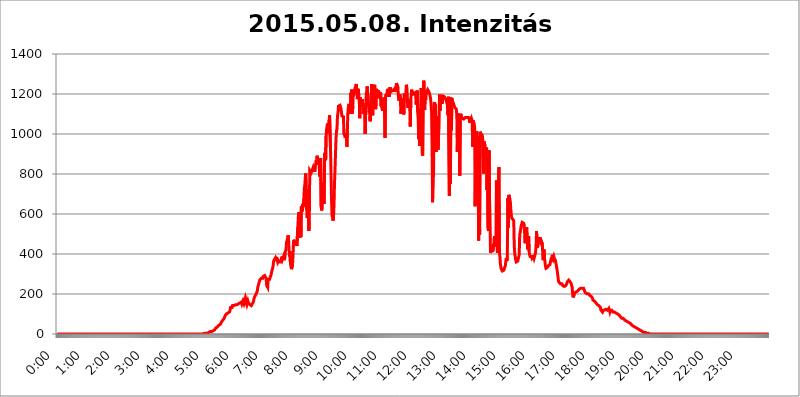
| Category | 2015.05.08. Intenzitás [W/m^2] |
|---|---|
| 0.0 | 0 |
| 0.0006944444444444445 | 0 |
| 0.001388888888888889 | 0 |
| 0.0020833333333333333 | 0 |
| 0.002777777777777778 | 0 |
| 0.003472222222222222 | 0 |
| 0.004166666666666667 | 0 |
| 0.004861111111111111 | 0 |
| 0.005555555555555556 | 0 |
| 0.0062499999999999995 | 0 |
| 0.006944444444444444 | 0 |
| 0.007638888888888889 | 0 |
| 0.008333333333333333 | 0 |
| 0.009027777777777779 | 0 |
| 0.009722222222222222 | 0 |
| 0.010416666666666666 | 0 |
| 0.011111111111111112 | 0 |
| 0.011805555555555555 | 0 |
| 0.012499999999999999 | 0 |
| 0.013194444444444444 | 0 |
| 0.013888888888888888 | 0 |
| 0.014583333333333332 | 0 |
| 0.015277777777777777 | 0 |
| 0.015972222222222224 | 0 |
| 0.016666666666666666 | 0 |
| 0.017361111111111112 | 0 |
| 0.018055555555555557 | 0 |
| 0.01875 | 0 |
| 0.019444444444444445 | 0 |
| 0.02013888888888889 | 0 |
| 0.020833333333333332 | 0 |
| 0.02152777777777778 | 0 |
| 0.022222222222222223 | 0 |
| 0.02291666666666667 | 0 |
| 0.02361111111111111 | 0 |
| 0.024305555555555556 | 0 |
| 0.024999999999999998 | 0 |
| 0.025694444444444447 | 0 |
| 0.02638888888888889 | 0 |
| 0.027083333333333334 | 0 |
| 0.027777777777777776 | 0 |
| 0.02847222222222222 | 0 |
| 0.029166666666666664 | 0 |
| 0.029861111111111113 | 0 |
| 0.030555555555555555 | 0 |
| 0.03125 | 0 |
| 0.03194444444444445 | 0 |
| 0.03263888888888889 | 0 |
| 0.03333333333333333 | 0 |
| 0.034027777777777775 | 0 |
| 0.034722222222222224 | 0 |
| 0.035416666666666666 | 0 |
| 0.036111111111111115 | 0 |
| 0.03680555555555556 | 0 |
| 0.0375 | 0 |
| 0.03819444444444444 | 0 |
| 0.03888888888888889 | 0 |
| 0.03958333333333333 | 0 |
| 0.04027777777777778 | 0 |
| 0.04097222222222222 | 0 |
| 0.041666666666666664 | 0 |
| 0.042361111111111106 | 0 |
| 0.04305555555555556 | 0 |
| 0.043750000000000004 | 0 |
| 0.044444444444444446 | 0 |
| 0.04513888888888889 | 0 |
| 0.04583333333333334 | 0 |
| 0.04652777777777778 | 0 |
| 0.04722222222222222 | 0 |
| 0.04791666666666666 | 0 |
| 0.04861111111111111 | 0 |
| 0.049305555555555554 | 0 |
| 0.049999999999999996 | 0 |
| 0.05069444444444445 | 0 |
| 0.051388888888888894 | 0 |
| 0.052083333333333336 | 0 |
| 0.05277777777777778 | 0 |
| 0.05347222222222222 | 0 |
| 0.05416666666666667 | 0 |
| 0.05486111111111111 | 0 |
| 0.05555555555555555 | 0 |
| 0.05625 | 0 |
| 0.05694444444444444 | 0 |
| 0.057638888888888885 | 0 |
| 0.05833333333333333 | 0 |
| 0.05902777777777778 | 0 |
| 0.059722222222222225 | 0 |
| 0.06041666666666667 | 0 |
| 0.061111111111111116 | 0 |
| 0.06180555555555556 | 0 |
| 0.0625 | 0 |
| 0.06319444444444444 | 0 |
| 0.06388888888888888 | 0 |
| 0.06458333333333334 | 0 |
| 0.06527777777777778 | 0 |
| 0.06597222222222222 | 0 |
| 0.06666666666666667 | 0 |
| 0.06736111111111111 | 0 |
| 0.06805555555555555 | 0 |
| 0.06874999999999999 | 0 |
| 0.06944444444444443 | 0 |
| 0.07013888888888889 | 0 |
| 0.07083333333333333 | 0 |
| 0.07152777777777779 | 0 |
| 0.07222222222222223 | 0 |
| 0.07291666666666667 | 0 |
| 0.07361111111111111 | 0 |
| 0.07430555555555556 | 0 |
| 0.075 | 0 |
| 0.07569444444444444 | 0 |
| 0.0763888888888889 | 0 |
| 0.07708333333333334 | 0 |
| 0.07777777777777778 | 0 |
| 0.07847222222222222 | 0 |
| 0.07916666666666666 | 0 |
| 0.0798611111111111 | 0 |
| 0.08055555555555556 | 0 |
| 0.08125 | 0 |
| 0.08194444444444444 | 0 |
| 0.08263888888888889 | 0 |
| 0.08333333333333333 | 0 |
| 0.08402777777777777 | 0 |
| 0.08472222222222221 | 0 |
| 0.08541666666666665 | 0 |
| 0.08611111111111112 | 0 |
| 0.08680555555555557 | 0 |
| 0.08750000000000001 | 0 |
| 0.08819444444444445 | 0 |
| 0.08888888888888889 | 0 |
| 0.08958333333333333 | 0 |
| 0.09027777777777778 | 0 |
| 0.09097222222222222 | 0 |
| 0.09166666666666667 | 0 |
| 0.09236111111111112 | 0 |
| 0.09305555555555556 | 0 |
| 0.09375 | 0 |
| 0.09444444444444444 | 0 |
| 0.09513888888888888 | 0 |
| 0.09583333333333333 | 0 |
| 0.09652777777777777 | 0 |
| 0.09722222222222222 | 0 |
| 0.09791666666666667 | 0 |
| 0.09861111111111111 | 0 |
| 0.09930555555555555 | 0 |
| 0.09999999999999999 | 0 |
| 0.10069444444444443 | 0 |
| 0.1013888888888889 | 0 |
| 0.10208333333333335 | 0 |
| 0.10277777777777779 | 0 |
| 0.10347222222222223 | 0 |
| 0.10416666666666667 | 0 |
| 0.10486111111111111 | 0 |
| 0.10555555555555556 | 0 |
| 0.10625 | 0 |
| 0.10694444444444444 | 0 |
| 0.1076388888888889 | 0 |
| 0.10833333333333334 | 0 |
| 0.10902777777777778 | 0 |
| 0.10972222222222222 | 0 |
| 0.1111111111111111 | 0 |
| 0.11180555555555556 | 0 |
| 0.11180555555555556 | 0 |
| 0.1125 | 0 |
| 0.11319444444444444 | 0 |
| 0.11388888888888889 | 0 |
| 0.11458333333333333 | 0 |
| 0.11527777777777777 | 0 |
| 0.11597222222222221 | 0 |
| 0.11666666666666665 | 0 |
| 0.1173611111111111 | 0 |
| 0.11805555555555557 | 0 |
| 0.11944444444444445 | 0 |
| 0.12013888888888889 | 0 |
| 0.12083333333333333 | 0 |
| 0.12152777777777778 | 0 |
| 0.12222222222222223 | 0 |
| 0.12291666666666667 | 0 |
| 0.12291666666666667 | 0 |
| 0.12361111111111112 | 0 |
| 0.12430555555555556 | 0 |
| 0.125 | 0 |
| 0.12569444444444444 | 0 |
| 0.12638888888888888 | 0 |
| 0.12708333333333333 | 0 |
| 0.16875 | 0 |
| 0.12847222222222224 | 0 |
| 0.12916666666666668 | 0 |
| 0.12986111111111112 | 0 |
| 0.13055555555555556 | 0 |
| 0.13125 | 0 |
| 0.13194444444444445 | 0 |
| 0.1326388888888889 | 0 |
| 0.13333333333333333 | 0 |
| 0.13402777777777777 | 0 |
| 0.13402777777777777 | 0 |
| 0.13472222222222222 | 0 |
| 0.13541666666666666 | 0 |
| 0.1361111111111111 | 0 |
| 0.13749999999999998 | 0 |
| 0.13819444444444443 | 0 |
| 0.1388888888888889 | 0 |
| 0.13958333333333334 | 0 |
| 0.14027777777777778 | 0 |
| 0.14097222222222222 | 0 |
| 0.14166666666666666 | 0 |
| 0.1423611111111111 | 0 |
| 0.14305555555555557 | 0 |
| 0.14375000000000002 | 0 |
| 0.14444444444444446 | 0 |
| 0.1451388888888889 | 0 |
| 0.1451388888888889 | 0 |
| 0.14652777777777778 | 0 |
| 0.14722222222222223 | 0 |
| 0.14791666666666667 | 0 |
| 0.1486111111111111 | 0 |
| 0.14930555555555555 | 0 |
| 0.15 | 0 |
| 0.15069444444444444 | 0 |
| 0.15138888888888888 | 0 |
| 0.15208333333333332 | 0 |
| 0.15277777777777776 | 0 |
| 0.15347222222222223 | 0 |
| 0.15416666666666667 | 0 |
| 0.15486111111111112 | 0 |
| 0.15555555555555556 | 0 |
| 0.15625 | 0 |
| 0.15694444444444444 | 0 |
| 0.15763888888888888 | 0 |
| 0.15833333333333333 | 0 |
| 0.15902777777777777 | 0 |
| 0.15972222222222224 | 0 |
| 0.16041666666666668 | 0 |
| 0.16111111111111112 | 0 |
| 0.16180555555555556 | 0 |
| 0.1625 | 0 |
| 0.16319444444444445 | 0 |
| 0.1638888888888889 | 0 |
| 0.16458333333333333 | 0 |
| 0.16527777777777777 | 0 |
| 0.16597222222222222 | 0 |
| 0.16666666666666666 | 0 |
| 0.1673611111111111 | 0 |
| 0.16805555555555554 | 0 |
| 0.16874999999999998 | 0 |
| 0.16944444444444443 | 0 |
| 0.17013888888888887 | 0 |
| 0.1708333333333333 | 0 |
| 0.17152777777777775 | 0 |
| 0.17222222222222225 | 0 |
| 0.1729166666666667 | 0 |
| 0.17361111111111113 | 0 |
| 0.17430555555555557 | 0 |
| 0.17500000000000002 | 0 |
| 0.17569444444444446 | 0 |
| 0.1763888888888889 | 0 |
| 0.17708333333333334 | 0 |
| 0.17777777777777778 | 0 |
| 0.17847222222222223 | 0 |
| 0.17916666666666667 | 0 |
| 0.1798611111111111 | 0 |
| 0.18055555555555555 | 0 |
| 0.18125 | 0 |
| 0.18194444444444444 | 0 |
| 0.1826388888888889 | 0 |
| 0.18333333333333335 | 0 |
| 0.1840277777777778 | 0 |
| 0.18472222222222223 | 0 |
| 0.18541666666666667 | 0 |
| 0.18611111111111112 | 0 |
| 0.18680555555555556 | 0 |
| 0.1875 | 0 |
| 0.18819444444444444 | 0 |
| 0.18888888888888888 | 0 |
| 0.18958333333333333 | 0 |
| 0.19027777777777777 | 0 |
| 0.1909722222222222 | 0 |
| 0.19166666666666665 | 0 |
| 0.19236111111111112 | 0 |
| 0.19305555555555554 | 0 |
| 0.19375 | 0 |
| 0.19444444444444445 | 0 |
| 0.1951388888888889 | 0 |
| 0.19583333333333333 | 0 |
| 0.19652777777777777 | 0 |
| 0.19722222222222222 | 0 |
| 0.19791666666666666 | 0 |
| 0.1986111111111111 | 0 |
| 0.19930555555555554 | 0 |
| 0.19999999999999998 | 0 |
| 0.20069444444444443 | 0 |
| 0.20138888888888887 | 0 |
| 0.2020833333333333 | 0 |
| 0.2027777777777778 | 0 |
| 0.2034722222222222 | 0 |
| 0.2041666666666667 | 0 |
| 0.20486111111111113 | 0 |
| 0.20555555555555557 | 0 |
| 0.20625000000000002 | 3.525 |
| 0.20694444444444446 | 3.525 |
| 0.2076388888888889 | 3.525 |
| 0.20833333333333334 | 3.525 |
| 0.20902777777777778 | 3.525 |
| 0.20972222222222223 | 3.525 |
| 0.21041666666666667 | 3.525 |
| 0.2111111111111111 | 7.887 |
| 0.21180555555555555 | 7.887 |
| 0.2125 | 7.887 |
| 0.21319444444444444 | 7.887 |
| 0.2138888888888889 | 12.257 |
| 0.21458333333333335 | 12.257 |
| 0.2152777777777778 | 12.257 |
| 0.21597222222222223 | 12.257 |
| 0.21666666666666667 | 12.257 |
| 0.21736111111111112 | 12.257 |
| 0.21805555555555556 | 16.636 |
| 0.21875 | 16.636 |
| 0.21944444444444444 | 21.024 |
| 0.22013888888888888 | 21.024 |
| 0.22083333333333333 | 21.024 |
| 0.22152777777777777 | 25.419 |
| 0.2222222222222222 | 29.823 |
| 0.22291666666666665 | 29.823 |
| 0.2236111111111111 | 29.823 |
| 0.22430555555555556 | 34.234 |
| 0.225 | 38.653 |
| 0.22569444444444445 | 38.653 |
| 0.2263888888888889 | 43.079 |
| 0.22708333333333333 | 43.079 |
| 0.22777777777777777 | 47.511 |
| 0.22847222222222222 | 47.511 |
| 0.22916666666666666 | 51.951 |
| 0.2298611111111111 | 56.398 |
| 0.23055555555555554 | 60.85 |
| 0.23124999999999998 | 65.31 |
| 0.23194444444444443 | 65.31 |
| 0.23263888888888887 | 69.775 |
| 0.2333333333333333 | 74.246 |
| 0.2340277777777778 | 74.246 |
| 0.2347222222222222 | 83.205 |
| 0.2354166666666667 | 92.184 |
| 0.23611111111111113 | 92.184 |
| 0.23680555555555557 | 96.682 |
| 0.23750000000000002 | 101.184 |
| 0.23819444444444446 | 105.69 |
| 0.2388888888888889 | 105.69 |
| 0.23958333333333334 | 105.69 |
| 0.24027777777777778 | 110.201 |
| 0.24097222222222223 | 110.201 |
| 0.24166666666666667 | 110.201 |
| 0.2423611111111111 | 119.235 |
| 0.24305555555555555 | 132.814 |
| 0.24375 | 137.347 |
| 0.24444444444444446 | 128.284 |
| 0.24513888888888888 | 132.814 |
| 0.24583333333333335 | 141.884 |
| 0.2465277777777778 | 137.347 |
| 0.24722222222222223 | 141.884 |
| 0.24791666666666667 | 141.884 |
| 0.24861111111111112 | 141.884 |
| 0.24930555555555556 | 146.423 |
| 0.25 | 146.423 |
| 0.25069444444444444 | 146.423 |
| 0.2513888888888889 | 146.423 |
| 0.2520833333333333 | 146.423 |
| 0.25277777777777777 | 146.423 |
| 0.2534722222222222 | 146.423 |
| 0.25416666666666665 | 150.964 |
| 0.2548611111111111 | 150.964 |
| 0.2555555555555556 | 155.509 |
| 0.25625000000000003 | 155.509 |
| 0.2569444444444445 | 155.509 |
| 0.2576388888888889 | 160.056 |
| 0.25833333333333336 | 160.056 |
| 0.2590277777777778 | 150.964 |
| 0.25972222222222224 | 155.509 |
| 0.2604166666666667 | 164.605 |
| 0.2611111111111111 | 164.605 |
| 0.26180555555555557 | 150.964 |
| 0.2625 | 160.056 |
| 0.26319444444444445 | 173.709 |
| 0.2638888888888889 | 182.82 |
| 0.26458333333333334 | 173.709 |
| 0.2652777777777778 | 155.509 |
| 0.2659722222222222 | 146.423 |
| 0.26666666666666666 | 150.964 |
| 0.2673611111111111 | 164.605 |
| 0.26805555555555555 | 155.509 |
| 0.26875 | 155.509 |
| 0.26944444444444443 | 150.964 |
| 0.2701388888888889 | 146.423 |
| 0.2708333333333333 | 141.884 |
| 0.27152777777777776 | 141.884 |
| 0.2722222222222222 | 141.884 |
| 0.27291666666666664 | 146.423 |
| 0.2736111111111111 | 150.964 |
| 0.2743055555555555 | 155.509 |
| 0.27499999999999997 | 160.056 |
| 0.27569444444444446 | 164.605 |
| 0.27638888888888885 | 182.82 |
| 0.27708333333333335 | 182.82 |
| 0.2777777777777778 | 187.378 |
| 0.27847222222222223 | 196.497 |
| 0.2791666666666667 | 196.497 |
| 0.2798611111111111 | 201.058 |
| 0.28055555555555556 | 214.746 |
| 0.28125 | 233 |
| 0.28194444444444444 | 242.127 |
| 0.2826388888888889 | 251.251 |
| 0.2833333333333333 | 260.373 |
| 0.28402777777777777 | 269.49 |
| 0.2847222222222222 | 274.047 |
| 0.28541666666666665 | 269.49 |
| 0.28611111111111115 | 278.603 |
| 0.28680555555555554 | 278.603 |
| 0.28750000000000003 | 274.047 |
| 0.2881944444444445 | 278.603 |
| 0.2888888888888889 | 287.709 |
| 0.28958333333333336 | 287.709 |
| 0.2902777777777778 | 287.709 |
| 0.29097222222222224 | 292.259 |
| 0.2916666666666667 | 292.259 |
| 0.2923611111111111 | 283.156 |
| 0.29305555555555557 | 274.047 |
| 0.29375 | 242.127 |
| 0.29444444444444445 | 237.564 |
| 0.2951388888888889 | 233 |
| 0.29583333333333334 | 274.047 |
| 0.2965277777777778 | 269.49 |
| 0.2972222222222222 | 269.49 |
| 0.29791666666666666 | 274.047 |
| 0.2986111111111111 | 283.156 |
| 0.29930555555555555 | 283.156 |
| 0.3 | 296.808 |
| 0.30069444444444443 | 310.44 |
| 0.3013888888888889 | 319.517 |
| 0.3020833333333333 | 328.584 |
| 0.30277777777777776 | 342.162 |
| 0.3034722222222222 | 364.728 |
| 0.30416666666666664 | 369.23 |
| 0.3048611111111111 | 373.729 |
| 0.3055555555555555 | 378.224 |
| 0.30624999999999997 | 382.715 |
| 0.3069444444444444 | 382.715 |
| 0.3076388888888889 | 373.729 |
| 0.30833333333333335 | 369.23 |
| 0.3090277777777778 | 360.221 |
| 0.30972222222222223 | 369.23 |
| 0.3104166666666667 | 373.729 |
| 0.3111111111111111 | 360.221 |
| 0.31180555555555556 | 364.728 |
| 0.3125 | 360.221 |
| 0.31319444444444444 | 360.221 |
| 0.3138888888888889 | 369.23 |
| 0.3145833333333333 | 378.224 |
| 0.31527777777777777 | 387.202 |
| 0.3159722222222222 | 373.729 |
| 0.31666666666666665 | 369.23 |
| 0.31736111111111115 | 387.202 |
| 0.31805555555555554 | 378.224 |
| 0.31875000000000003 | 369.23 |
| 0.3194444444444445 | 405.108 |
| 0.3201388888888889 | 409.574 |
| 0.32083333333333336 | 422.943 |
| 0.3215277777777778 | 458.38 |
| 0.32222222222222224 | 467.187 |
| 0.3229166666666667 | 475.972 |
| 0.3236111111111111 | 493.475 |
| 0.32430555555555557 | 484.735 |
| 0.325 | 427.39 |
| 0.32569444444444445 | 387.202 |
| 0.3263888888888889 | 414.035 |
| 0.32708333333333334 | 351.198 |
| 0.3277777777777778 | 355.712 |
| 0.3284722222222222 | 324.052 |
| 0.32916666666666666 | 319.517 |
| 0.3298611111111111 | 342.162 |
| 0.33055555555555555 | 382.715 |
| 0.33125 | 453.968 |
| 0.33194444444444443 | 471.582 |
| 0.3326388888888889 | 458.38 |
| 0.3333333333333333 | 449.551 |
| 0.3340277777777778 | 445.129 |
| 0.3347222222222222 | 449.551 |
| 0.3354166666666667 | 458.38 |
| 0.3361111111111111 | 440.702 |
| 0.3368055555555556 | 440.702 |
| 0.33749999999999997 | 536.82 |
| 0.33819444444444446 | 588.009 |
| 0.33888888888888885 | 609.062 |
| 0.33958333333333335 | 613.252 |
| 0.34027777777777773 | 480.356 |
| 0.34097222222222223 | 609.062 |
| 0.3416666666666666 | 484.735 |
| 0.3423611111111111 | 638.256 |
| 0.3430555555555555 | 634.105 |
| 0.34375 | 613.252 |
| 0.3444444444444445 | 650.667 |
| 0.3451388888888889 | 638.256 |
| 0.3458333333333334 | 675.311 |
| 0.34652777777777777 | 727.896 |
| 0.34722222222222227 | 743.859 |
| 0.34791666666666665 | 783.342 |
| 0.34861111111111115 | 802.868 |
| 0.34930555555555554 | 629.948 |
| 0.35000000000000003 | 617.436 |
| 0.3506944444444444 | 579.542 |
| 0.3513888888888889 | 679.395 |
| 0.3520833333333333 | 723.889 |
| 0.3527777777777778 | 515.223 |
| 0.3534722222222222 | 558.261 |
| 0.3541666666666667 | 818.392 |
| 0.3548611111111111 | 822.26 |
| 0.35555555555555557 | 818.392 |
| 0.35625 | 806.757 |
| 0.35694444444444445 | 806.757 |
| 0.3576388888888889 | 806.757 |
| 0.35833333333333334 | 826.123 |
| 0.3590277777777778 | 833.834 |
| 0.3597222222222222 | 829.981 |
| 0.36041666666666666 | 833.834 |
| 0.3611111111111111 | 810.641 |
| 0.36180555555555555 | 837.682 |
| 0.3625 | 849.199 |
| 0.36319444444444443 | 868.305 |
| 0.3638888888888889 | 853.029 |
| 0.3645833333333333 | 891.099 |
| 0.3652777777777778 | 860.676 |
| 0.3659722222222222 | 845.365 |
| 0.3666666666666667 | 872.114 |
| 0.3673611111111111 | 845.365 |
| 0.3680555555555556 | 787.258 |
| 0.36874999999999997 | 860.676 |
| 0.36944444444444446 | 879.719 |
| 0.37013888888888885 | 638.256 |
| 0.37083333333333335 | 617.436 |
| 0.37152777777777773 | 634.105 |
| 0.37222222222222223 | 759.723 |
| 0.3729166666666666 | 735.89 |
| 0.3736111111111111 | 667.123 |
| 0.3743055555555555 | 650.667 |
| 0.375 | 906.223 |
| 0.3756944444444445 | 894.885 |
| 0.3763888888888889 | 868.305 |
| 0.3770833333333334 | 988.714 |
| 0.37777777777777777 | 1022.323 |
| 0.37847222222222227 | 1041.019 |
| 0.37916666666666665 | 1052.255 |
| 0.37986111111111115 | 1011.118 |
| 0.38055555555555554 | 1003.65 |
| 0.38125000000000003 | 1067.267 |
| 0.3819444444444444 | 1093.653 |
| 0.3826388888888889 | 1089.873 |
| 0.3833333333333333 | 913.766 |
| 0.3840277777777778 | 913.766 |
| 0.3847222222222222 | 667.123 |
| 0.3854166666666667 | 592.233 |
| 0.3861111111111111 | 583.779 |
| 0.38680555555555557 | 566.793 |
| 0.3875 | 583.779 |
| 0.38819444444444445 | 650.667 |
| 0.3888888888888889 | 755.766 |
| 0.38958333333333334 | 822.26 |
| 0.3902777777777778 | 902.447 |
| 0.3909722222222222 | 977.508 |
| 0.39166666666666666 | 1014.852 |
| 0.3923611111111111 | 1026.06 |
| 0.39305555555555555 | 1089.873 |
| 0.39375 | 1105.019 |
| 0.39444444444444443 | 1139.384 |
| 0.3951388888888889 | 1135.543 |
| 0.3958333333333333 | 1139.384 |
| 0.3965277777777778 | 1143.232 |
| 0.3972222222222222 | 1147.086 |
| 0.3979166666666667 | 1127.879 |
| 0.3986111111111111 | 1124.056 |
| 0.3993055555555556 | 1089.873 |
| 0.39999999999999997 | 1086.097 |
| 0.40069444444444446 | 1093.653 |
| 0.40138888888888885 | 1086.097 |
| 0.40208333333333335 | 996.182 |
| 0.40277777777777773 | 1003.65 |
| 0.40347222222222223 | 988.714 |
| 0.4041666666666666 | 992.448 |
| 0.4048611111111111 | 984.98 |
| 0.4055555555555555 | 992.448 |
| 0.40625 | 936.33 |
| 0.4069444444444445 | 1029.798 |
| 0.4076388888888889 | 1108.816 |
| 0.4083333333333334 | 1135.543 |
| 0.40902777777777777 | 1150.946 |
| 0.40972222222222227 | 1143.232 |
| 0.41041666666666665 | 1124.056 |
| 0.41111111111111115 | 1101.226 |
| 0.41180555555555554 | 1205.82 |
| 0.41250000000000003 | 1182.099 |
| 0.4131944444444444 | 1221.83 |
| 0.4138888888888889 | 1101.226 |
| 0.4145833333333333 | 1143.232 |
| 0.4152777777777778 | 1209.807 |
| 0.4159722222222222 | 1193.918 |
| 0.4166666666666667 | 1213.804 |
| 0.4173611111111111 | 1225.859 |
| 0.41805555555555557 | 1233.951 |
| 0.41875 | 1242.089 |
| 0.41944444444444445 | 1250.275 |
| 0.4201388888888889 | 1217.812 |
| 0.42083333333333334 | 1174.263 |
| 0.4215277777777778 | 1201.843 |
| 0.4222222222222222 | 1225.859 |
| 0.42291666666666666 | 1189.969 |
| 0.4236111111111111 | 1166.46 |
| 0.42430555555555555 | 1078.555 |
| 0.425 | 1182.099 |
| 0.42569444444444443 | 1135.543 |
| 0.4263888888888889 | 1147.086 |
| 0.4270833333333333 | 1139.384 |
| 0.4277777777777778 | 1174.263 |
| 0.4284722222222222 | 1147.086 |
| 0.4291666666666667 | 1108.816 |
| 0.4298611111111111 | 1101.226 |
| 0.4305555555555556 | 1120.238 |
| 0.43124999999999997 | 1154.814 |
| 0.43194444444444446 | 999.916 |
| 0.43263888888888885 | 1116.426 |
| 0.43333333333333335 | 1197.876 |
| 0.43402777777777773 | 1213.804 |
| 0.43472222222222223 | 1238.014 |
| 0.4354166666666666 | 1233.951 |
| 0.4361111111111111 | 1162.571 |
| 0.4368055555555555 | 1162.571 |
| 0.4375 | 1108.816 |
| 0.4381944444444445 | 1124.056 |
| 0.4388888888888889 | 1063.51 |
| 0.4395833333333334 | 1120.238 |
| 0.44027777777777777 | 1158.689 |
| 0.44097222222222227 | 1250.275 |
| 0.44166666666666665 | 1246.176 |
| 0.44236111111111115 | 1093.653 |
| 0.44305555555555554 | 1186.03 |
| 0.44375000000000003 | 1135.543 |
| 0.4444444444444444 | 1233.951 |
| 0.4451388888888889 | 1246.176 |
| 0.4458333333333333 | 1174.263 |
| 0.4465277777777778 | 1124.056 |
| 0.4472222222222222 | 1154.814 |
| 0.4479166666666667 | 1225.859 |
| 0.4486111111111111 | 1178.177 |
| 0.44930555555555557 | 1209.807 |
| 0.45 | 1197.876 |
| 0.45069444444444445 | 1217.812 |
| 0.4513888888888889 | 1182.099 |
| 0.45208333333333334 | 1178.177 |
| 0.4527777777777778 | 1186.03 |
| 0.4534722222222222 | 1209.807 |
| 0.45416666666666666 | 1139.384 |
| 0.4548611111111111 | 1147.086 |
| 0.45555555555555555 | 1143.232 |
| 0.45625 | 1116.426 |
| 0.45694444444444443 | 1154.814 |
| 0.4576388888888889 | 1174.263 |
| 0.4583333333333333 | 1182.099 |
| 0.4590277777777778 | 1097.437 |
| 0.4597222222222222 | 981.244 |
| 0.4604166666666667 | 1186.03 |
| 0.4611111111111111 | 1197.876 |
| 0.4618055555555556 | 1186.03 |
| 0.46249999999999997 | 1201.843 |
| 0.46319444444444446 | 1225.859 |
| 0.46388888888888885 | 1197.876 |
| 0.46458333333333335 | 1189.969 |
| 0.46527777777777773 | 1205.82 |
| 0.46597222222222223 | 1186.03 |
| 0.4666666666666666 | 1233.951 |
| 0.4673611111111111 | 1221.83 |
| 0.4680555555555555 | 1225.859 |
| 0.46875 | 1213.804 |
| 0.4694444444444445 | 1217.812 |
| 0.4701388888888889 | 1217.812 |
| 0.4708333333333334 | 1217.812 |
| 0.47152777777777777 | 1221.83 |
| 0.47222222222222227 | 1221.83 |
| 0.47291666666666665 | 1225.859 |
| 0.47361111111111115 | 1209.807 |
| 0.47430555555555554 | 1225.859 |
| 0.47500000000000003 | 1233.951 |
| 0.4756944444444444 | 1254.387 |
| 0.4763888888888889 | 1254.387 |
| 0.4770833333333333 | 1250.275 |
| 0.4777777777777778 | 1233.951 |
| 0.4784722222222222 | 1186.03 |
| 0.4791666666666667 | 1166.46 |
| 0.4798611111111111 | 1178.177 |
| 0.48055555555555557 | 1197.876 |
| 0.48125 | 1178.177 |
| 0.48194444444444445 | 1101.226 |
| 0.4826388888888889 | 1101.226 |
| 0.48333333333333334 | 1139.384 |
| 0.4840277777777778 | 1178.177 |
| 0.4847222222222222 | 1174.263 |
| 0.48541666666666666 | 1131.708 |
| 0.4861111111111111 | 1097.437 |
| 0.48680555555555555 | 1201.843 |
| 0.4875 | 1186.03 |
| 0.48819444444444443 | 1189.969 |
| 0.4888888888888889 | 1193.918 |
| 0.4895833333333333 | 1246.176 |
| 0.4902777777777778 | 1233.951 |
| 0.4909722222222222 | 1189.969 |
| 0.4916666666666667 | 1131.708 |
| 0.4923611111111111 | 1154.814 |
| 0.4930555555555556 | 1170.358 |
| 0.49374999999999997 | 1162.571 |
| 0.49444444444444446 | 1131.708 |
| 0.49513888888888885 | 1037.277 |
| 0.49583333333333335 | 1170.358 |
| 0.49652777777777773 | 1201.843 |
| 0.49722222222222223 | 1221.83 |
| 0.4979166666666666 | 1193.918 |
| 0.4986111111111111 | 1209.807 |
| 0.4993055555555555 | 1201.843 |
| 0.5 | 1197.876 |
| 0.5006944444444444 | 1201.843 |
| 0.5013888888888889 | 1205.82 |
| 0.5020833333333333 | 1209.807 |
| 0.5027777777777778 | 1189.969 |
| 0.5034722222222222 | 1147.086 |
| 0.5041666666666667 | 1189.969 |
| 0.5048611111111111 | 1217.812 |
| 0.5055555555555555 | 1108.816 |
| 0.50625 | 1074.789 |
| 0.5069444444444444 | 973.772 |
| 0.5076388888888889 | 1063.51 |
| 0.5083333333333333 | 940.082 |
| 0.5090277777777777 | 1105.019 |
| 0.5097222222222222 | 1131.708 |
| 0.5104166666666666 | 1229.899 |
| 0.5111111111111112 | 1174.263 |
| 0.5118055555555555 | 906.223 |
| 0.5125000000000001 | 891.099 |
| 0.5131944444444444 | 1182.099 |
| 0.513888888888889 | 1266.8 |
| 0.5145833333333333 | 1250.275 |
| 0.5152777777777778 | 1120.238 |
| 0.5159722222222222 | 1182.099 |
| 0.5166666666666667 | 1170.358 |
| 0.517361111111111 | 1217.812 |
| 0.5180555555555556 | 1209.807 |
| 0.5187499999999999 | 1209.807 |
| 0.5194444444444445 | 1221.83 |
| 0.5201388888888888 | 1221.83 |
| 0.5208333333333334 | 1213.804 |
| 0.5215277777777778 | 1209.807 |
| 0.5222222222222223 | 1201.843 |
| 0.5229166666666667 | 1197.876 |
| 0.5236111111111111 | 1178.177 |
| 0.5243055555555556 | 1147.086 |
| 0.525 | 1108.816 |
| 0.5256944444444445 | 940.082 |
| 0.5263888888888889 | 658.909 |
| 0.5270833333333333 | 775.492 |
| 0.5277777777777778 | 791.169 |
| 0.5284722222222222 | 1150.946 |
| 0.5291666666666667 | 1158.689 |
| 0.5298611111111111 | 1139.384 |
| 0.5305555555555556 | 1147.086 |
| 0.53125 | 909.996 |
| 0.5319444444444444 | 1089.873 |
| 0.5326388888888889 | 955.071 |
| 0.5333333333333333 | 1074.789 |
| 0.5340277777777778 | 921.298 |
| 0.5347222222222222 | 992.448 |
| 0.5354166666666667 | 1029.798 |
| 0.5361111111111111 | 1197.876 |
| 0.5368055555555555 | 1116.426 |
| 0.5375 | 1186.03 |
| 0.5381944444444444 | 1193.918 |
| 0.5388888888888889 | 1174.263 |
| 0.5395833333333333 | 1150.946 |
| 0.5402777777777777 | 1162.571 |
| 0.5409722222222222 | 1189.969 |
| 0.5416666666666666 | 1189.969 |
| 0.5423611111111112 | 1193.918 |
| 0.5430555555555555 | 1186.03 |
| 0.5437500000000001 | 1186.03 |
| 0.5444444444444444 | 1178.177 |
| 0.545138888888889 | 1170.358 |
| 0.5458333333333333 | 1162.571 |
| 0.5465277777777778 | 1154.814 |
| 0.5472222222222222 | 1147.086 |
| 0.5479166666666667 | 1093.653 |
| 0.548611111111111 | 1186.03 |
| 0.5493055555555556 | 1186.03 |
| 0.5499999999999999 | 691.608 |
| 0.5506944444444445 | 1127.879 |
| 0.5513888888888888 | 751.803 |
| 0.5520833333333334 | 1182.099 |
| 0.5527777777777778 | 1018.587 |
| 0.5534722222222223 | 1178.177 |
| 0.5541666666666667 | 1162.571 |
| 0.5548611111111111 | 1158.689 |
| 0.5555555555555556 | 1154.814 |
| 0.55625 | 1147.086 |
| 0.5569444444444445 | 1139.384 |
| 0.5576388888888889 | 1131.708 |
| 0.5583333333333333 | 1135.543 |
| 0.5590277777777778 | 1127.879 |
| 0.5597222222222222 | 1124.056 |
| 0.5604166666666667 | 1093.653 |
| 0.5611111111111111 | 909.996 |
| 0.5618055555555556 | 1105.019 |
| 0.5625 | 962.555 |
| 0.5631944444444444 | 1093.653 |
| 0.5638888888888889 | 992.448 |
| 0.5645833333333333 | 791.169 |
| 0.5652777777777778 | 1078.555 |
| 0.5659722222222222 | 1101.226 |
| 0.5666666666666667 | 1089.873 |
| 0.5673611111111111 | 1086.097 |
| 0.5680555555555555 | 1078.555 |
| 0.56875 | 1078.555 |
| 0.5694444444444444 | 1074.789 |
| 0.5701388888888889 | 1074.789 |
| 0.5708333333333333 | 1078.555 |
| 0.5715277777777777 | 1078.555 |
| 0.5722222222222222 | 1082.324 |
| 0.5729166666666666 | 1086.097 |
| 0.5736111111111112 | 1086.097 |
| 0.5743055555555555 | 1082.324 |
| 0.5750000000000001 | 1078.555 |
| 0.5756944444444444 | 1082.324 |
| 0.576388888888889 | 1082.324 |
| 0.5770833333333333 | 1082.324 |
| 0.5777777777777778 | 1074.789 |
| 0.5784722222222222 | 1056.004 |
| 0.5791666666666667 | 1086.097 |
| 0.579861111111111 | 1078.555 |
| 0.5805555555555556 | 1063.51 |
| 0.5812499999999999 | 1074.789 |
| 0.5819444444444445 | 1067.267 |
| 0.5826388888888888 | 936.33 |
| 0.5833333333333334 | 1067.267 |
| 0.5840277777777778 | 1067.267 |
| 0.5847222222222223 | 1048.508 |
| 0.5854166666666667 | 1037.277 |
| 0.5861111111111111 | 638.256 |
| 0.5868055555555556 | 875.918 |
| 0.5875 | 977.508 |
| 0.5881944444444445 | 1014.852 |
| 0.5888888888888889 | 810.641 |
| 0.5895833333333333 | 723.889 |
| 0.5902777777777778 | 988.714 |
| 0.5909722222222222 | 467.187 |
| 0.5916666666666667 | 767.62 |
| 0.5923611111111111 | 497.836 |
| 0.5930555555555556 | 1011.118 |
| 0.59375 | 1003.65 |
| 0.5944444444444444 | 1007.383 |
| 0.5951388888888889 | 999.916 |
| 0.5958333333333333 | 996.182 |
| 0.5965277777777778 | 984.98 |
| 0.5972222222222222 | 984.98 |
| 0.5979166666666667 | 802.868 |
| 0.5986111111111111 | 962.555 |
| 0.5993055555555555 | 958.814 |
| 0.6 | 940.082 |
| 0.6006944444444444 | 902.447 |
| 0.6013888888888889 | 917.534 |
| 0.6020833333333333 | 932.576 |
| 0.6027777777777777 | 719.877 |
| 0.6034722222222222 | 818.392 |
| 0.6041666666666666 | 528.2 |
| 0.6048611111111112 | 515.223 |
| 0.6055555555555555 | 917.534 |
| 0.6062500000000001 | 683.473 |
| 0.6069444444444444 | 588.009 |
| 0.607638888888889 | 405.108 |
| 0.6083333333333333 | 409.574 |
| 0.6090277777777778 | 427.39 |
| 0.6097222222222222 | 409.574 |
| 0.6104166666666667 | 422.943 |
| 0.611111111111111 | 414.035 |
| 0.6118055555555556 | 449.551 |
| 0.6124999999999999 | 436.27 |
| 0.6131944444444445 | 489.108 |
| 0.6138888888888888 | 458.38 |
| 0.6145833333333334 | 436.27 |
| 0.6152777777777778 | 462.786 |
| 0.6159722222222223 | 767.62 |
| 0.6166666666666667 | 497.836 |
| 0.6173611111111111 | 405.108 |
| 0.6180555555555556 | 654.791 |
| 0.61875 | 755.766 |
| 0.6194444444444445 | 833.834 |
| 0.6201388888888889 | 405.108 |
| 0.6208333333333333 | 387.202 |
| 0.6215277777777778 | 351.198 |
| 0.6222222222222222 | 333.113 |
| 0.6229166666666667 | 324.052 |
| 0.6236111111111111 | 319.517 |
| 0.6243055555555556 | 314.98 |
| 0.625 | 314.98 |
| 0.6256944444444444 | 314.98 |
| 0.6263888888888889 | 319.517 |
| 0.6270833333333333 | 328.584 |
| 0.6277777777777778 | 333.113 |
| 0.6284722222222222 | 342.162 |
| 0.6291666666666667 | 364.728 |
| 0.6298611111111111 | 378.224 |
| 0.6305555555555555 | 364.728 |
| 0.63125 | 382.715 |
| 0.6319444444444444 | 679.395 |
| 0.6326388888888889 | 532.513 |
| 0.6333333333333333 | 695.666 |
| 0.6340277777777777 | 687.544 |
| 0.6347222222222222 | 683.473 |
| 0.6354166666666666 | 663.019 |
| 0.6361111111111112 | 625.784 |
| 0.6368055555555555 | 596.45 |
| 0.6375000000000001 | 579.542 |
| 0.6381944444444444 | 575.299 |
| 0.638888888888889 | 575.299 |
| 0.6395833333333333 | 571.049 |
| 0.6402777777777778 | 562.53 |
| 0.6409722222222222 | 440.702 |
| 0.6416666666666667 | 400.638 |
| 0.642361111111111 | 387.202 |
| 0.6430555555555556 | 369.23 |
| 0.6437499999999999 | 360.221 |
| 0.6444444444444445 | 355.712 |
| 0.6451388888888888 | 360.221 |
| 0.6458333333333334 | 364.728 |
| 0.6465277777777778 | 360.221 |
| 0.6472222222222223 | 364.728 |
| 0.6479166666666667 | 396.164 |
| 0.6486111111111111 | 497.836 |
| 0.6493055555555556 | 506.542 |
| 0.65 | 523.88 |
| 0.6506944444444445 | 541.121 |
| 0.6513888888888889 | 549.704 |
| 0.6520833333333333 | 558.261 |
| 0.6527777777777778 | 562.53 |
| 0.6534722222222222 | 562.53 |
| 0.6541666666666667 | 553.986 |
| 0.6548611111111111 | 545.416 |
| 0.6555555555555556 | 541.121 |
| 0.65625 | 453.968 |
| 0.6569444444444444 | 523.88 |
| 0.6576388888888889 | 462.786 |
| 0.6583333333333333 | 532.513 |
| 0.6590277777777778 | 480.356 |
| 0.6597222222222222 | 422.943 |
| 0.6604166666666667 | 431.833 |
| 0.6611111111111111 | 489.108 |
| 0.6618055555555555 | 414.035 |
| 0.6625 | 396.164 |
| 0.6631944444444444 | 387.202 |
| 0.6638888888888889 | 387.202 |
| 0.6645833333333333 | 387.202 |
| 0.6652777777777777 | 387.202 |
| 0.6659722222222222 | 378.224 |
| 0.6666666666666666 | 373.729 |
| 0.6673611111111111 | 382.715 |
| 0.6680555555555556 | 387.202 |
| 0.6687500000000001 | 378.224 |
| 0.6694444444444444 | 382.715 |
| 0.6701388888888888 | 396.164 |
| 0.6708333333333334 | 409.574 |
| 0.6715277777777778 | 436.27 |
| 0.6722222222222222 | 515.223 |
| 0.6729166666666666 | 440.702 |
| 0.6736111111111112 | 431.833 |
| 0.6743055555555556 | 436.27 |
| 0.6749999999999999 | 475.972 |
| 0.6756944444444444 | 462.786 |
| 0.6763888888888889 | 458.38 |
| 0.6770833333333334 | 484.735 |
| 0.6777777777777777 | 458.38 |
| 0.6784722222222223 | 471.582 |
| 0.6791666666666667 | 445.129 |
| 0.6798611111111111 | 458.38 |
| 0.6805555555555555 | 431.833 |
| 0.68125 | 369.23 |
| 0.6819444444444445 | 378.224 |
| 0.6826388888888889 | 422.943 |
| 0.6833333333333332 | 387.202 |
| 0.6840277777777778 | 382.715 |
| 0.6847222222222222 | 337.639 |
| 0.6854166666666667 | 328.584 |
| 0.686111111111111 | 324.052 |
| 0.6868055555555556 | 324.052 |
| 0.6875 | 333.113 |
| 0.6881944444444444 | 337.639 |
| 0.688888888888889 | 342.162 |
| 0.6895833333333333 | 342.162 |
| 0.6902777777777778 | 342.162 |
| 0.6909722222222222 | 346.682 |
| 0.6916666666666668 | 346.682 |
| 0.6923611111111111 | 346.682 |
| 0.6930555555555555 | 382.715 |
| 0.69375 | 360.221 |
| 0.6944444444444445 | 396.164 |
| 0.6951388888888889 | 400.638 |
| 0.6958333333333333 | 378.224 |
| 0.6965277777777777 | 387.202 |
| 0.6972222222222223 | 378.224 |
| 0.6979166666666666 | 378.224 |
| 0.6986111111111111 | 369.23 |
| 0.6993055555555556 | 355.712 |
| 0.7000000000000001 | 342.162 |
| 0.7006944444444444 | 328.584 |
| 0.7013888888888888 | 310.44 |
| 0.7020833333333334 | 292.259 |
| 0.7027777777777778 | 269.49 |
| 0.7034722222222222 | 260.373 |
| 0.7041666666666666 | 255.813 |
| 0.7048611111111112 | 255.813 |
| 0.7055555555555556 | 251.251 |
| 0.7062499999999999 | 246.689 |
| 0.7069444444444444 | 246.689 |
| 0.7076388888888889 | 251.251 |
| 0.7083333333333334 | 246.689 |
| 0.7090277777777777 | 242.127 |
| 0.7097222222222223 | 237.564 |
| 0.7104166666666667 | 237.564 |
| 0.7111111111111111 | 237.564 |
| 0.7118055555555555 | 233 |
| 0.7125 | 237.564 |
| 0.7131944444444445 | 242.127 |
| 0.7138888888888889 | 246.689 |
| 0.7145833333333332 | 251.251 |
| 0.7152777777777778 | 260.373 |
| 0.7159722222222222 | 260.373 |
| 0.7166666666666667 | 264.932 |
| 0.717361111111111 | 269.49 |
| 0.7180555555555556 | 269.49 |
| 0.71875 | 264.932 |
| 0.7194444444444444 | 260.373 |
| 0.720138888888889 | 255.813 |
| 0.7208333333333333 | 251.251 |
| 0.7215277777777778 | 242.127 |
| 0.7222222222222222 | 233 |
| 0.7229166666666668 | 196.497 |
| 0.7236111111111111 | 182.82 |
| 0.7243055555555555 | 178.264 |
| 0.725 | 182.82 |
| 0.7256944444444445 | 205.62 |
| 0.7263888888888889 | 210.182 |
| 0.7270833333333333 | 210.182 |
| 0.7277777777777777 | 210.182 |
| 0.7284722222222223 | 214.746 |
| 0.7291666666666666 | 214.746 |
| 0.7298611111111111 | 214.746 |
| 0.7305555555555556 | 219.309 |
| 0.7312500000000001 | 219.309 |
| 0.7319444444444444 | 223.873 |
| 0.7326388888888888 | 228.436 |
| 0.7333333333333334 | 228.436 |
| 0.7340277777777778 | 228.436 |
| 0.7347222222222222 | 223.873 |
| 0.7354166666666666 | 223.873 |
| 0.7361111111111112 | 228.436 |
| 0.7368055555555556 | 228.436 |
| 0.7374999999999999 | 228.436 |
| 0.7381944444444444 | 228.436 |
| 0.7388888888888889 | 223.873 |
| 0.7395833333333334 | 214.746 |
| 0.7402777777777777 | 210.182 |
| 0.7409722222222223 | 205.62 |
| 0.7416666666666667 | 205.62 |
| 0.7423611111111111 | 205.62 |
| 0.7430555555555555 | 201.058 |
| 0.74375 | 201.058 |
| 0.7444444444444445 | 196.497 |
| 0.7451388888888889 | 201.058 |
| 0.7458333333333332 | 196.497 |
| 0.7465277777777778 | 196.497 |
| 0.7472222222222222 | 191.937 |
| 0.7479166666666667 | 191.937 |
| 0.748611111111111 | 187.378 |
| 0.7493055555555556 | 187.378 |
| 0.75 | 182.82 |
| 0.7506944444444444 | 178.264 |
| 0.751388888888889 | 169.156 |
| 0.7520833333333333 | 169.156 |
| 0.7527777777777778 | 169.156 |
| 0.7534722222222222 | 164.605 |
| 0.7541666666666668 | 164.605 |
| 0.7548611111111111 | 160.056 |
| 0.7555555555555555 | 155.509 |
| 0.75625 | 155.509 |
| 0.7569444444444445 | 150.964 |
| 0.7576388888888889 | 146.423 |
| 0.7583333333333333 | 141.884 |
| 0.7590277777777777 | 146.423 |
| 0.7597222222222223 | 141.884 |
| 0.7604166666666666 | 137.347 |
| 0.7611111111111111 | 137.347 |
| 0.7618055555555556 | 132.814 |
| 0.7625000000000001 | 119.235 |
| 0.7631944444444444 | 114.716 |
| 0.7638888888888888 | 114.716 |
| 0.7645833333333334 | 110.201 |
| 0.7652777777777778 | 119.235 |
| 0.7659722222222222 | 114.716 |
| 0.7666666666666666 | 123.758 |
| 0.7673611111111112 | 119.235 |
| 0.7680555555555556 | 123.758 |
| 0.7687499999999999 | 123.758 |
| 0.7694444444444444 | 123.758 |
| 0.7701388888888889 | 119.235 |
| 0.7708333333333334 | 119.235 |
| 0.7715277777777777 | 119.235 |
| 0.7722222222222223 | 123.758 |
| 0.7729166666666667 | 123.758 |
| 0.7736111111111111 | 128.284 |
| 0.7743055555555555 | 123.758 |
| 0.775 | 110.201 |
| 0.7756944444444445 | 119.235 |
| 0.7763888888888889 | 119.235 |
| 0.7770833333333332 | 119.235 |
| 0.7777777777777778 | 119.235 |
| 0.7784722222222222 | 114.716 |
| 0.7791666666666667 | 110.201 |
| 0.779861111111111 | 110.201 |
| 0.7805555555555556 | 110.201 |
| 0.78125 | 110.201 |
| 0.7819444444444444 | 105.69 |
| 0.782638888888889 | 105.69 |
| 0.7833333333333333 | 105.69 |
| 0.7840277777777778 | 101.184 |
| 0.7847222222222222 | 101.184 |
| 0.7854166666666668 | 101.184 |
| 0.7861111111111111 | 96.682 |
| 0.7868055555555555 | 96.682 |
| 0.7875 | 96.682 |
| 0.7881944444444445 | 92.184 |
| 0.7888888888888889 | 92.184 |
| 0.7895833333333333 | 87.692 |
| 0.7902777777777777 | 83.205 |
| 0.7909722222222223 | 83.205 |
| 0.7916666666666666 | 78.722 |
| 0.7923611111111111 | 83.205 |
| 0.7930555555555556 | 78.722 |
| 0.7937500000000001 | 78.722 |
| 0.7944444444444444 | 74.246 |
| 0.7951388888888888 | 74.246 |
| 0.7958333333333334 | 69.775 |
| 0.7965277777777778 | 69.775 |
| 0.7972222222222222 | 65.31 |
| 0.7979166666666666 | 65.31 |
| 0.7986111111111112 | 60.85 |
| 0.7993055555555556 | 60.85 |
| 0.7999999999999999 | 60.85 |
| 0.8006944444444444 | 60.85 |
| 0.8013888888888889 | 56.398 |
| 0.8020833333333334 | 56.398 |
| 0.8027777777777777 | 51.951 |
| 0.8034722222222223 | 51.951 |
| 0.8041666666666667 | 51.951 |
| 0.8048611111111111 | 47.511 |
| 0.8055555555555555 | 47.511 |
| 0.80625 | 43.079 |
| 0.8069444444444445 | 43.079 |
| 0.8076388888888889 | 38.653 |
| 0.8083333333333332 | 38.653 |
| 0.8090277777777778 | 38.653 |
| 0.8097222222222222 | 34.234 |
| 0.8104166666666667 | 34.234 |
| 0.811111111111111 | 29.823 |
| 0.8118055555555556 | 29.823 |
| 0.8125 | 29.823 |
| 0.8131944444444444 | 29.823 |
| 0.813888888888889 | 25.419 |
| 0.8145833333333333 | 25.419 |
| 0.8152777777777778 | 21.024 |
| 0.8159722222222222 | 21.024 |
| 0.8166666666666668 | 21.024 |
| 0.8173611111111111 | 21.024 |
| 0.8180555555555555 | 21.024 |
| 0.81875 | 16.636 |
| 0.8194444444444445 | 16.636 |
| 0.8201388888888889 | 12.257 |
| 0.8208333333333333 | 12.257 |
| 0.8215277777777777 | 12.257 |
| 0.8222222222222223 | 12.257 |
| 0.8229166666666666 | 7.887 |
| 0.8236111111111111 | 7.887 |
| 0.8243055555555556 | 7.887 |
| 0.8250000000000001 | 7.887 |
| 0.8256944444444444 | 3.525 |
| 0.8263888888888888 | 3.525 |
| 0.8270833333333334 | 3.525 |
| 0.8277777777777778 | 3.525 |
| 0.8284722222222222 | 3.525 |
| 0.8291666666666666 | 3.525 |
| 0.8298611111111112 | 3.525 |
| 0.8305555555555556 | 3.525 |
| 0.8312499999999999 | 0 |
| 0.8319444444444444 | 0 |
| 0.8326388888888889 | 0 |
| 0.8333333333333334 | 0 |
| 0.8340277777777777 | 0 |
| 0.8347222222222223 | 0 |
| 0.8354166666666667 | 0 |
| 0.8361111111111111 | 0 |
| 0.8368055555555555 | 0 |
| 0.8375 | 0 |
| 0.8381944444444445 | 0 |
| 0.8388888888888889 | 0 |
| 0.8395833333333332 | 0 |
| 0.8402777777777778 | 0 |
| 0.8409722222222222 | 0 |
| 0.8416666666666667 | 0 |
| 0.842361111111111 | 0 |
| 0.8430555555555556 | 0 |
| 0.84375 | 0 |
| 0.8444444444444444 | 0 |
| 0.845138888888889 | 0 |
| 0.8458333333333333 | 0 |
| 0.8465277777777778 | 0 |
| 0.8472222222222222 | 0 |
| 0.8479166666666668 | 0 |
| 0.8486111111111111 | 0 |
| 0.8493055555555555 | 0 |
| 0.85 | 0 |
| 0.8506944444444445 | 0 |
| 0.8513888888888889 | 0 |
| 0.8520833333333333 | 0 |
| 0.8527777777777777 | 0 |
| 0.8534722222222223 | 0 |
| 0.8541666666666666 | 0 |
| 0.8548611111111111 | 0 |
| 0.8555555555555556 | 0 |
| 0.8562500000000001 | 0 |
| 0.8569444444444444 | 0 |
| 0.8576388888888888 | 0 |
| 0.8583333333333334 | 0 |
| 0.8590277777777778 | 0 |
| 0.8597222222222222 | 0 |
| 0.8604166666666666 | 0 |
| 0.8611111111111112 | 0 |
| 0.8618055555555556 | 0 |
| 0.8624999999999999 | 0 |
| 0.8631944444444444 | 0 |
| 0.8638888888888889 | 0 |
| 0.8645833333333334 | 0 |
| 0.8652777777777777 | 0 |
| 0.8659722222222223 | 0 |
| 0.8666666666666667 | 0 |
| 0.8673611111111111 | 0 |
| 0.8680555555555555 | 0 |
| 0.86875 | 0 |
| 0.8694444444444445 | 0 |
| 0.8701388888888889 | 0 |
| 0.8708333333333332 | 0 |
| 0.8715277777777778 | 0 |
| 0.8722222222222222 | 0 |
| 0.8729166666666667 | 0 |
| 0.873611111111111 | 0 |
| 0.8743055555555556 | 0 |
| 0.875 | 0 |
| 0.8756944444444444 | 0 |
| 0.876388888888889 | 0 |
| 0.8770833333333333 | 0 |
| 0.8777777777777778 | 0 |
| 0.8784722222222222 | 0 |
| 0.8791666666666668 | 0 |
| 0.8798611111111111 | 0 |
| 0.8805555555555555 | 0 |
| 0.88125 | 0 |
| 0.8819444444444445 | 0 |
| 0.8826388888888889 | 0 |
| 0.8833333333333333 | 0 |
| 0.8840277777777777 | 0 |
| 0.8847222222222223 | 0 |
| 0.8854166666666666 | 0 |
| 0.8861111111111111 | 0 |
| 0.8868055555555556 | 0 |
| 0.8875000000000001 | 0 |
| 0.8881944444444444 | 0 |
| 0.8888888888888888 | 0 |
| 0.8895833333333334 | 0 |
| 0.8902777777777778 | 0 |
| 0.8909722222222222 | 0 |
| 0.8916666666666666 | 0 |
| 0.8923611111111112 | 0 |
| 0.8930555555555556 | 0 |
| 0.8937499999999999 | 0 |
| 0.8944444444444444 | 0 |
| 0.8951388888888889 | 0 |
| 0.8958333333333334 | 0 |
| 0.8965277777777777 | 0 |
| 0.8972222222222223 | 0 |
| 0.8979166666666667 | 0 |
| 0.8986111111111111 | 0 |
| 0.8993055555555555 | 0 |
| 0.9 | 0 |
| 0.9006944444444445 | 0 |
| 0.9013888888888889 | 0 |
| 0.9020833333333332 | 0 |
| 0.9027777777777778 | 0 |
| 0.9034722222222222 | 0 |
| 0.9041666666666667 | 0 |
| 0.904861111111111 | 0 |
| 0.9055555555555556 | 0 |
| 0.90625 | 0 |
| 0.9069444444444444 | 0 |
| 0.907638888888889 | 0 |
| 0.9083333333333333 | 0 |
| 0.9090277777777778 | 0 |
| 0.9097222222222222 | 0 |
| 0.9104166666666668 | 0 |
| 0.9111111111111111 | 0 |
| 0.9118055555555555 | 0 |
| 0.9125 | 0 |
| 0.9131944444444445 | 0 |
| 0.9138888888888889 | 0 |
| 0.9145833333333333 | 0 |
| 0.9152777777777777 | 0 |
| 0.9159722222222223 | 0 |
| 0.9166666666666666 | 0 |
| 0.9173611111111111 | 0 |
| 0.9180555555555556 | 0 |
| 0.9187500000000001 | 0 |
| 0.9194444444444444 | 0 |
| 0.9201388888888888 | 0 |
| 0.9208333333333334 | 0 |
| 0.9215277777777778 | 0 |
| 0.9222222222222222 | 0 |
| 0.9229166666666666 | 0 |
| 0.9236111111111112 | 0 |
| 0.9243055555555556 | 0 |
| 0.9249999999999999 | 0 |
| 0.9256944444444444 | 0 |
| 0.9263888888888889 | 0 |
| 0.9270833333333334 | 0 |
| 0.9277777777777777 | 0 |
| 0.9284722222222223 | 0 |
| 0.9291666666666667 | 0 |
| 0.9298611111111111 | 0 |
| 0.9305555555555555 | 0 |
| 0.93125 | 0 |
| 0.9319444444444445 | 0 |
| 0.9326388888888889 | 0 |
| 0.9333333333333332 | 0 |
| 0.9340277777777778 | 0 |
| 0.9347222222222222 | 0 |
| 0.9354166666666667 | 0 |
| 0.936111111111111 | 0 |
| 0.9368055555555556 | 0 |
| 0.9375 | 0 |
| 0.9381944444444444 | 0 |
| 0.938888888888889 | 0 |
| 0.9395833333333333 | 0 |
| 0.9402777777777778 | 0 |
| 0.9409722222222222 | 0 |
| 0.9416666666666668 | 0 |
| 0.9423611111111111 | 0 |
| 0.9430555555555555 | 0 |
| 0.94375 | 0 |
| 0.9444444444444445 | 0 |
| 0.9451388888888889 | 0 |
| 0.9458333333333333 | 0 |
| 0.9465277777777777 | 0 |
| 0.9472222222222223 | 0 |
| 0.9479166666666666 | 0 |
| 0.9486111111111111 | 0 |
| 0.9493055555555556 | 0 |
| 0.9500000000000001 | 0 |
| 0.9506944444444444 | 0 |
| 0.9513888888888888 | 0 |
| 0.9520833333333334 | 0 |
| 0.9527777777777778 | 0 |
| 0.9534722222222222 | 0 |
| 0.9541666666666666 | 0 |
| 0.9548611111111112 | 0 |
| 0.9555555555555556 | 0 |
| 0.9562499999999999 | 0 |
| 0.9569444444444444 | 0 |
| 0.9576388888888889 | 0 |
| 0.9583333333333334 | 0 |
| 0.9590277777777777 | 0 |
| 0.9597222222222223 | 0 |
| 0.9604166666666667 | 0 |
| 0.9611111111111111 | 0 |
| 0.9618055555555555 | 0 |
| 0.9625 | 0 |
| 0.9631944444444445 | 0 |
| 0.9638888888888889 | 0 |
| 0.9645833333333332 | 0 |
| 0.9652777777777778 | 0 |
| 0.9659722222222222 | 0 |
| 0.9666666666666667 | 0 |
| 0.967361111111111 | 0 |
| 0.9680555555555556 | 0 |
| 0.96875 | 0 |
| 0.9694444444444444 | 0 |
| 0.970138888888889 | 0 |
| 0.9708333333333333 | 0 |
| 0.9715277777777778 | 0 |
| 0.9722222222222222 | 0 |
| 0.9729166666666668 | 0 |
| 0.9736111111111111 | 0 |
| 0.9743055555555555 | 0 |
| 0.975 | 0 |
| 0.9756944444444445 | 0 |
| 0.9763888888888889 | 0 |
| 0.9770833333333333 | 0 |
| 0.9777777777777777 | 0 |
| 0.9784722222222223 | 0 |
| 0.9791666666666666 | 0 |
| 0.9798611111111111 | 0 |
| 0.9805555555555556 | 0 |
| 0.9812500000000001 | 0 |
| 0.9819444444444444 | 0 |
| 0.9826388888888888 | 0 |
| 0.9833333333333334 | 0 |
| 0.9840277777777778 | 0 |
| 0.9847222222222222 | 0 |
| 0.9854166666666666 | 0 |
| 0.9861111111111112 | 0 |
| 0.9868055555555556 | 0 |
| 0.9874999999999999 | 0 |
| 0.9881944444444444 | 0 |
| 0.9888888888888889 | 0 |
| 0.9895833333333334 | 0 |
| 0.9902777777777777 | 0 |
| 0.9909722222222223 | 0 |
| 0.9916666666666667 | 0 |
| 0.9923611111111111 | 0 |
| 0.9930555555555555 | 0 |
| 0.99375 | 0 |
| 0.9944444444444445 | 0 |
| 0.9951388888888889 | 0 |
| 0.9958333333333332 | 0 |
| 0.9965277777777778 | 0 |
| 0.9972222222222222 | 0 |
| 0.9979166666666667 | 0 |
| 0.998611111111111 | 0 |
| 0.9993055555555556 | 0 |